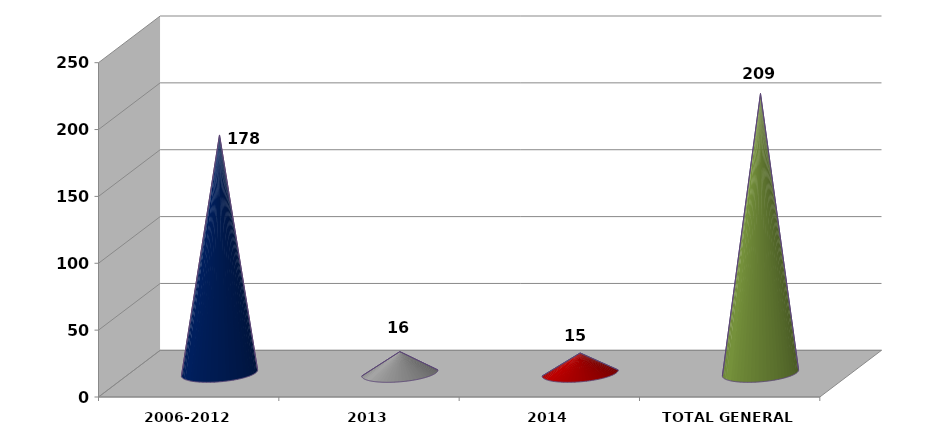
| Category | Series 0 |
|---|---|
| 2006-2012 | 178 |
| 2013 | 16 |
| 2014 | 15 |
| TOTAL GENERAL | 209 |